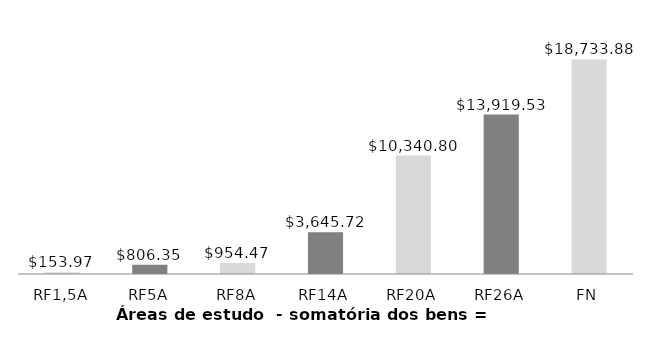
| Category | Series 0 |
|---|---|
| RF1,5A | 153.971 |
| RF5A | 806.35 |
| RF8A | 954.471 |
| RF14A | 3645.716 |
| RF20A | 10340.796 |
| RF26A | 13919.525 |
| FN | 18733.875 |